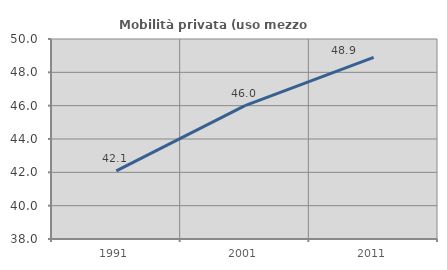
| Category | Mobilità privata (uso mezzo privato) |
|---|---|
| 1991.0 | 42.092 |
| 2001.0 | 46.001 |
| 2011.0 | 48.894 |